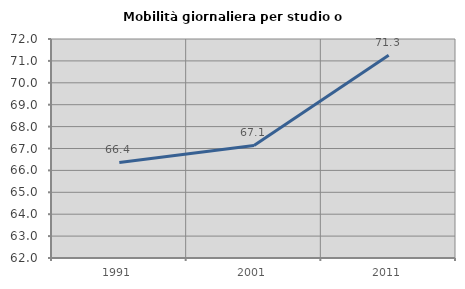
| Category | Mobilità giornaliera per studio o lavoro |
|---|---|
| 1991.0 | 66.362 |
| 2001.0 | 67.139 |
| 2011.0 | 71.253 |